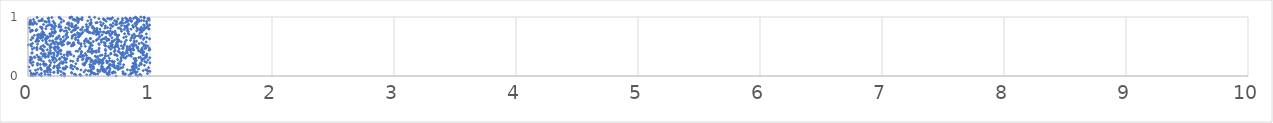
| Category | Series 0 |
|---|---|
| 0.7210757157536596 | 0.001 |
| 0.2989265851600752 | 0.002 |
| 0.9000821290145526 | 0.003 |
| 0.10947811891331494 | 0.004 |
| 0.04043967258399417 | 0.005 |
| 0.8376584052452829 | 0.006 |
| 0.026146847696138176 | 0.007 |
| 0.4328127904075124 | 0.008 |
| 0.8267326904231929 | 0.009 |
| 0.6585111228385325 | 0.01 |
| 0.9276628801899037 | 0.011 |
| 0.272278882932699 | 0.012 |
| 0.3926854934674824 | 0.013 |
| 0.18231622238900014 | 0.014 |
| 0.5095273871715241 | 0.015 |
| 0.8852031067765893 | 0.016 |
| 0.42643215903502185 | 0.017 |
| 0.059935583318995955 | 0.018 |
| 0.4809977433462945 | 0.019 |
| 0.16782910024507736 | 0.02 |
| 0.09316453717053252 | 0.021 |
| 0.7907250100718527 | 0.022 |
| 0.3857004847560078 | 0.023 |
| 0.4255585206848159 | 0.024 |
| 0.049419505402485187 | 0.025 |
| 0.6673545228250559 | 0.026 |
| 0.9171170175370059 | 0.027 |
| 0.38049555178321215 | 0.028 |
| 0.38638861033530436 | 0.029 |
| 0.14040069428345192 | 0.03 |
| 0.030642846496321097 | 0.031 |
| 0.5534999506559373 | 0.032 |
| 0.6495359501686248 | 0.033 |
| 0.3000917611044036 | 0.034 |
| 0.5427265277521784 | 0.035 |
| 0.8001576215564252 | 0.036 |
| 0.058565500979314566 | 0.037 |
| 0.04289846613452941 | 0.038 |
| 0.5723878880102399 | 0.039 |
| 0.7794816791335246 | 0.04 |
| 0.8411530563791975 | 0.041 |
| 0.9788533906604586 | 0.042 |
| 0.10970321104490843 | 0.043 |
| 0.5427314494202757 | 0.044 |
| 0.8498427818133956 | 0.045 |
| 0.29006370694518135 | 0.046 |
| 0.6506995016621157 | 0.047 |
| 0.02436283394171601 | 0.048 |
| 0.5200776425651998 | 0.049 |
| 0.6922005602271805 | 0.05 |
| 0.35854809630641893 | 0.051 |
| 0.7808786690038981 | 0.052 |
| 0.07402303675006461 | 0.053 |
| 0.24488214861204982 | 0.054 |
| 0.5305747288440449 | 0.055 |
| 0.8828841478558047 | 0.056 |
| 0.6954582827002016 | 0.057 |
| 0.3564258205151243 | 0.058 |
| 0.6913655197751492 | 0.059 |
| 0.7140232793334049 | 0.06 |
| 0.21004310257870018 | 0.061 |
| 0.8574704761486299 | 0.062 |
| 0.8679387637363696 | 0.063 |
| 0.18259161229031518 | 0.064 |
| 0.21422101752278055 | 0.065 |
| 0.6664067608362094 | 0.066 |
| 0.45959798751054415 | 0.067 |
| 0.15925088069788707 | 0.068 |
| 0.6348497576022162 | 0.069 |
| 0.8943841726293321 | 0.07 |
| 0.6281480698567632 | 0.071 |
| 0.7026516487185294 | 0.072 |
| 0.7779968495659232 | 0.073 |
| 0.5172572847217972 | 0.074 |
| 0.2704747958899747 | 0.075 |
| 0.13402724621408568 | 0.076 |
| 0.5881572272380724 | 0.077 |
| 0.9990344237598981 | 0.078 |
| 0.5133411046875807 | 0.079 |
| 0.6163663384614241 | 0.08 |
| 0.14228685457018153 | 0.081 |
| 0.5735538115490929 | 0.082 |
| 0.24654197819015478 | 0.083 |
| 0.9835086448790668 | 0.084 |
| 0.498593642804361 | 0.085 |
| 0.8749568164736927 | 0.086 |
| 0.49280286827748343 | 0.087 |
| 0.017346005906562878 | 0.088 |
| 0.6670152089388754 | 0.089 |
| 0.24894723392164386 | 0.09 |
| 0.9443205094887137 | 0.091 |
| 0.15813861067305646 | 0.092 |
| 0.24504026729531747 | 0.093 |
| 0.9775952237302944 | 0.094 |
| 0.6348667324303842 | 0.095 |
| 0.8391949864393048 | 0.096 |
| 0.06190213424419122 | 0.097 |
| 0.6154363124993141 | 0.098 |
| 0.47138724294197243 | 0.099 |
| 0.5136304304355692 | 0.1 |
| 0.43451845607670847 | 0.101 |
| 0.5718536091870989 | 0.102 |
| 0.5199059428949439 | 0.103 |
| 0.18459046426065895 | 0.104 |
| 0.17366434245243534 | 0.105 |
| 0.8147292378643486 | 0.106 |
| 0.9658043023019626 | 0.107 |
| 0.8706700151596727 | 0.108 |
| 0.10994075476835985 | 0.109 |
| 0.5970762837808996 | 0.11 |
| 0.854021269132305 | 0.111 |
| 0.7385922094919226 | 0.112 |
| 0.7418805030588554 | 0.113 |
| 0.29488644689727617 | 0.114 |
| 0.08140896163242661 | 0.115 |
| 0.6138732214986259 | 0.116 |
| 0.9062549506711998 | 0.117 |
| 0.3674051521951712 | 0.118 |
| 0.6225967629325416 | 0.119 |
| 0.16001259704083148 | 0.12 |
| 0.40652136543497164 | 0.121 |
| 0.3059076159507106 | 0.122 |
| 0.24648703166983255 | 0.123 |
| 0.17324443153000457 | 0.124 |
| 0.6725463648833583 | 0.125 |
| 0.61174687437837 | 0.126 |
| 0.399982566187824 | 0.127 |
| 0.6470994550307 | 0.128 |
| 0.5378220052708061 | 0.129 |
| 0.8711960430068021 | 0.13 |
| 0.5342572378955679 | 0.131 |
| 0.28638792737146057 | 0.132 |
| 0.7336366363484794 | 0.133 |
| 0.2924707362753357 | 0.134 |
| 0.758371457862031 | 0.135 |
| 0.7158906764775873 | 0.136 |
| 0.7628057716368419 | 0.137 |
| 0.10263753716967305 | 0.138 |
| 0.3506594092406672 | 0.139 |
| 0.21002128644068474 | 0.14 |
| 0.9875201829687993 | 0.141 |
| 0.1619580608958432 | 0.142 |
| 0.6540378630274599 | 0.143 |
| 0.8882529655415882 | 0.144 |
| 0.25865330087943905 | 0.145 |
| 0.2387487456786015 | 0.146 |
| 0.16351998095403542 | 0.147 |
| 0.777580641729575 | 0.148 |
| 0.5119197420914714 | 0.149 |
| 0.31843429713041993 | 0.15 |
| 0.7058444956360657 | 0.151 |
| 0.8574668615925476 | 0.152 |
| 0.008070416194821739 | 0.153 |
| 0.6086145802135168 | 0.154 |
| 0.6621210968759669 | 0.155 |
| 0.6619147044841546 | 0.156 |
| 0.8545281187465874 | 0.157 |
| 0.6080328342083019 | 0.158 |
| 0.3823285374581695 | 0.159 |
| 0.5366483728365018 | 0.16 |
| 0.6011960573795215 | 0.161 |
| 0.31124584441423775 | 0.162 |
| 0.8628599150664559 | 0.163 |
| 0.5191793822243911 | 0.164 |
| 0.7409790467848674 | 0.165 |
| 0.8869061776484861 | 0.166 |
| 0.17696402461778815 | 0.167 |
| 0.21685029689673507 | 0.168 |
| 0.5102896732666365 | 0.169 |
| 0.7300531628552824 | 0.17 |
| 0.36157757971813154 | 0.171 |
| 0.6919241419508552 | 0.172 |
| 0.8679782778862162 | 0.173 |
| 0.24216752925409957 | 0.174 |
| 0.35212633146471983 | 0.175 |
| 0.13678966365264045 | 0.176 |
| 0.9116738722368598 | 0.177 |
| 0.7044519702452783 | 0.178 |
| 0.3553126324411906 | 0.179 |
| 0.5189088892865402 | 0.18 |
| 0.9547105365185021 | 0.181 |
| 0.038127611285978524 | 0.182 |
| 0.6702026357527971 | 0.183 |
| 0.18163057918791703 | 0.184 |
| 0.07786117387902758 | 0.185 |
| 0.4606843811129724 | 0.186 |
| 0.2546271264985037 | 0.187 |
| 0.6689690770090997 | 0.188 |
| 0.7842074549459827 | 0.189 |
| 0.14968710963572007 | 0.19 |
| 0.46270043377741055 | 0.191 |
| 0.13665122851060474 | 0.192 |
| 0.5065750376332786 | 0.193 |
| 0.675863379049547 | 0.194 |
| 0.8853062580979848 | 0.195 |
| 0.10051173781103595 | 0.196 |
| 0.702789771151127 | 0.197 |
| 0.12841367516878333 | 0.198 |
| 0.9292910685136894 | 0.199 |
| 0.12959795341944402 | 0.2 |
| 0.7562174939081766 | 0.201 |
| 0.45005737925494704 | 0.202 |
| 0.1407330098968702 | 0.203 |
| 0.12831138843680767 | 0.204 |
| 0.8745258126317434 | 0.205 |
| 0.5811936389561184 | 0.206 |
| 0.6056014076742957 | 0.207 |
| 0.9242970961061321 | 0.208 |
| 0.3927566318276803 | 0.209 |
| 0.534009398452319 | 0.21 |
| 0.5489094535295872 | 0.211 |
| 0.28188360323676254 | 0.212 |
| 0.2599949119441829 | 0.213 |
| 0.07832147189925154 | 0.214 |
| 0.025188086981462243 | 0.215 |
| 0.7422451927611835 | 0.216 |
| 0.860800881905322 | 0.217 |
| 0.46370342496185346 | 0.218 |
| 0.9225494298928072 | 0.219 |
| 0.5425298097760574 | 0.22 |
| 0.6163873099898138 | 0.221 |
| 0.2889374134576238 | 0.222 |
| 0.6495001251611316 | 0.223 |
| 0.9990132359650231 | 0.224 |
| 0.650295007836843 | 0.225 |
| 0.47280584722660846 | 0.226 |
| 0.6990052348544215 | 0.227 |
| 0.18702264352550013 | 0.228 |
| 0.9723218593729294 | 0.229 |
| 0.29079006444968714 | 0.23 |
| 0.3125662497456033 | 0.231 |
| 0.2177005317458538 | 0.232 |
| 0.5914535935894576 | 0.233 |
| 0.8792446512119577 | 0.234 |
| 0.04248100462328064 | 0.235 |
| 0.5756050601108011 | 0.236 |
| 0.6506869706622691 | 0.237 |
| 0.5617526958728309 | 0.238 |
| 0.6082924878706019 | 0.239 |
| 0.2754196331329576 | 0.24 |
| 0.5154132024791686 | 0.241 |
| 0.017545923957011267 | 0.242 |
| 0.12759780830335365 | 0.243 |
| 0.7073635761500626 | 0.244 |
| 0.9584881517609275 | 0.245 |
| 0.7582191738133515 | 0.246 |
| 0.6895943118848235 | 0.247 |
| 0.3680063421629647 | 0.248 |
| 0.5431479827110831 | 0.249 |
| 0.5206833043588635 | 0.25 |
| 0.5784357333386534 | 0.251 |
| 0.4817474268431772 | 0.252 |
| 0.6893397859311813 | 0.253 |
| 0.878172736813518 | 0.254 |
| 0.6432311320550751 | 0.255 |
| 0.34959527669613344 | 0.256 |
| 0.6676213800285858 | 0.257 |
| 0.9342676573753379 | 0.258 |
| 0.5173602275671156 | 0.259 |
| 0.17603989437212064 | 0.26 |
| 0.4067987170120677 | 0.261 |
| 0.8838337499884558 | 0.262 |
| 0.8871132139931058 | 0.263 |
| 0.23504058183472665 | 0.264 |
| 0.1087322810933461 | 0.265 |
| 0.7635461462532201 | 0.266 |
| 0.20537391214698564 | 0.267 |
| 0.594452615871023 | 0.268 |
| 0.30170983834987253 | 0.269 |
| 0.5557868469854249 | 0.27 |
| 0.4783299405408188 | 0.271 |
| 0.9831407160521641 | 0.272 |
| 0.5234314439553772 | 0.273 |
| 0.6108272540907288 | 0.274 |
| 0.01644683085317622 | 0.275 |
| 0.4461334835144811 | 0.276 |
| 0.08847333643659516 | 0.277 |
| 0.7349414650630675 | 0.278 |
| 0.6156961316484116 | 0.279 |
| 0.0290944397070243 | 0.28 |
| 0.20184487301246923 | 0.281 |
| 0.259252226098324 | 0.282 |
| 0.31360663814240053 | 0.283 |
| 0.2046473946518782 | 0.284 |
| 0.9331819331798564 | 0.285 |
| 0.8777192377690918 | 0.286 |
| 0.9403291724191035 | 0.287 |
| 0.49255471691415087 | 0.288 |
| 0.5783075625545605 | 0.289 |
| 0.3185698828960907 | 0.29 |
| 0.4077013007586274 | 0.291 |
| 0.1060889975442274 | 0.292 |
| 0.948653179887867 | 0.293 |
| 0.4522807809927608 | 0.294 |
| 0.8681703638850157 | 0.295 |
| 0.301736736388613 | 0.296 |
| 0.2597961905755358 | 0.297 |
| 0.8816857522671876 | 0.298 |
| 0.22350650507824765 | 0.299 |
| 0.5083475468655909 | 0.3 |
| 0.6666974718932039 | 0.301 |
| 0.7978874445272033 | 0.302 |
| 0.6262560378153953 | 0.303 |
| 0.4821397148627352 | 0.304 |
| 0.02945537063661785 | 0.305 |
| 0.49373557308125704 | 0.306 |
| 0.7643427294269092 | 0.307 |
| 0.29728209812901507 | 0.308 |
| 0.9619062339465713 | 0.309 |
| 0.9980874058942363 | 0.31 |
| 0.05637753653543942 | 0.311 |
| 0.9078455281775442 | 0.312 |
| 0.7644026433603119 | 0.313 |
| 0.7862463732100281 | 0.314 |
| 0.21182670599094267 | 0.315 |
| 0.921608592586544 | 0.316 |
| 0.1418444484118636 | 0.317 |
| 0.08269069203202983 | 0.318 |
| 0.09428149524336693 | 0.319 |
| 0.5631708534605753 | 0.32 |
| 0.020087590254180276 | 0.321 |
| 0.2774874136585832 | 0.322 |
| 0.050359147794461045 | 0.323 |
| 0.9702013628032757 | 0.324 |
| 0.1975659146478237 | 0.325 |
| 0.16690738356669665 | 0.326 |
| 0.4273368200520453 | 0.327 |
| 0.14624323308448772 | 0.328 |
| 0.43905520418846955 | 0.329 |
| 0.57270099116623 | 0.33 |
| 0.4174305538330355 | 0.331 |
| 0.8088734970209466 | 0.332 |
| 0.8457224602285318 | 0.333 |
| 0.6350830926671499 | 0.334 |
| 0.5504235750380612 | 0.335 |
| 0.12114598333544369 | 0.336 |
| 0.37610349666111076 | 0.337 |
| 0.9726020182688154 | 0.338 |
| 0.45789537538776204 | 0.339 |
| 0.23901064458285648 | 0.34 |
| 0.32417671824738037 | 0.341 |
| 0.9623730830173374 | 0.342 |
| 0.7316335424702959 | 0.343 |
| 0.6570736529194579 | 0.344 |
| 0.6339614023577463 | 0.345 |
| 0.47934776001750434 | 0.346 |
| 0.450088438837034 | 0.347 |
| 0.5925824909882226 | 0.348 |
| 0.7812049166427784 | 0.349 |
| 0.827664353694022 | 0.35 |
| 0.16630293439816402 | 0.351 |
| 0.7732514586429635 | 0.352 |
| 0.07377069541614367 | 0.353 |
| 0.6075511643695319 | 0.354 |
| 0.2954089938622019 | 0.355 |
| 0.9418425406323444 | 0.356 |
| 0.21398010608531137 | 0.357 |
| 0.7232720056567803 | 0.358 |
| 0.7139591477125702 | 0.359 |
| 0.7108441540734324 | 0.36 |
| 0.1264873315648778 | 0.361 |
| 0.13647488744453973 | 0.362 |
| 0.8444022728128121 | 0.363 |
| 0.35353027062375997 | 0.364 |
| 0.2450625903071295 | 0.365 |
| 0.13811698869958555 | 0.366 |
| 0.9450672852378702 | 0.367 |
| 0.7638396645166099 | 0.368 |
| 0.3179253763783799 | 0.369 |
| 0.34159261332528057 | 0.37 |
| 0.4331996249434473 | 0.371 |
| 0.9748741301679823 | 0.372 |
| 0.6778101371705476 | 0.373 |
| 0.18308310946795958 | 0.374 |
| 0.14171553402207726 | 0.375 |
| 0.13370401589096814 | 0.376 |
| 0.26885084400335857 | 0.377 |
| 0.8592734256729139 | 0.378 |
| 0.7954542486420636 | 0.379 |
| 0.46992454120686145 | 0.38 |
| 0.6355293393602538 | 0.381 |
| 0.7600331612921489 | 0.382 |
| 0.10878309441259448 | 0.383 |
| 0.6798303783693587 | 0.384 |
| 0.5249780834113048 | 0.385 |
| 0.03206839631767655 | 0.386 |
| 0.17877729065115944 | 0.387 |
| 0.1948435103795031 | 0.388 |
| 0.24450818007682085 | 0.389 |
| 0.21339154059951548 | 0.39 |
| 0.81433718378727 | 0.391 |
| 0.33814986949393677 | 0.392 |
| 0.340241658540967 | 0.393 |
| 0.17063767525423645 | 0.394 |
| 0.7758485495579943 | 0.395 |
| 0.03363944550812892 | 0.396 |
| 0.9417981043945421 | 0.397 |
| 0.9255202552975204 | 0.398 |
| 0.7793864667869613 | 0.399 |
| 0.3240337484924495 | 0.4 |
| 0.5588029934734943 | 0.401 |
| 0.7506627527765466 | 0.402 |
| 0.4384610805472434 | 0.403 |
| 0.24095528802749144 | 0.404 |
| 0.8440585181917223 | 0.405 |
| 0.9469581283379359 | 0.406 |
| 0.9482286038480302 | 0.407 |
| 0.3445583771227654 | 0.408 |
| 0.32828142125068804 | 0.409 |
| 0.8077475183541016 | 0.41 |
| 0.5803354550789511 | 0.411 |
| 0.5073919869033248 | 0.412 |
| 0.7078714407118015 | 0.413 |
| 0.5421371083143695 | 0.414 |
| 0.4383714600283911 | 0.415 |
| 0.5199634460527002 | 0.416 |
| 0.25565169546685795 | 0.417 |
| 0.7390118082130677 | 0.418 |
| 0.4906166428473757 | 0.419 |
| 0.4093506284338122 | 0.42 |
| 0.39370009381890514 | 0.421 |
| 0.5335773624270365 | 0.422 |
| 0.9203672280666437 | 0.423 |
| 0.4937298917718783 | 0.424 |
| 0.12633569073658568 | 0.425 |
| 0.5579896407327306 | 0.426 |
| 0.906791766730479 | 0.427 |
| 0.12280045910080761 | 0.428 |
| 0.9318291597716524 | 0.429 |
| 0.6362633731395777 | 0.43 |
| 0.9254075710624784 | 0.431 |
| 0.2711285001179622 | 0.432 |
| 0.18270840018388357 | 0.433 |
| 0.22552982454494974 | 0.434 |
| 0.929687994636196 | 0.435 |
| 0.7128788189450189 | 0.436 |
| 0.26578994557077174 | 0.437 |
| 0.9918890682903168 | 0.438 |
| 0.5786590418405029 | 0.439 |
| 0.82834390289123 | 0.44 |
| 0.8091550449191578 | 0.441 |
| 0.8670110847807508 | 0.442 |
| 0.07395535791818086 | 0.443 |
| 0.15801697483177912 | 0.444 |
| 0.8420784356487386 | 0.445 |
| 0.12041346718280588 | 0.446 |
| 0.9300892459747976 | 0.447 |
| 0.9982403552579645 | 0.448 |
| 0.9359544300214305 | 0.449 |
| 0.6344741235169882 | 0.45 |
| 0.8598731321625254 | 0.451 |
| 0.11428187942486412 | 0.452 |
| 0.861722414196641 | 0.453 |
| 0.6782922467358006 | 0.454 |
| 0.42447511901385315 | 0.455 |
| 0.0358636738968553 | 0.456 |
| 0.5229913672471264 | 0.457 |
| 0.747729481537171 | 0.458 |
| 0.5032213540697893 | 0.459 |
| 0.2483572041784291 | 0.46 |
| 0.8407170462101533 | 0.461 |
| 0.959066329176043 | 0.462 |
| 0.21497748240375014 | 0.463 |
| 0.9003665048937085 | 0.464 |
| 0.7750172626942908 | 0.465 |
| 0.10114258460016867 | 0.466 |
| 0.4240310337850348 | 0.467 |
| 0.07285559417100274 | 0.468 |
| 0.8382389106059709 | 0.469 |
| 0.9941360447711691 | 0.47 |
| 0.934859448884598 | 0.471 |
| 0.58338482854518 | 0.472 |
| 0.7814982172367695 | 0.473 |
| 0.815241480416861 | 0.474 |
| 0.24713598140410242 | 0.475 |
| 0.05063907220975772 | 0.476 |
| 0.18088641507700332 | 0.477 |
| 0.506234801875241 | 0.478 |
| 0.9671193752261402 | 0.479 |
| 0.21319851571478976 | 0.48 |
| 0.24932100242044186 | 0.481 |
| 0.6661786536033643 | 0.482 |
| 0.706571183758089 | 0.483 |
| 0.8942031509591887 | 0.484 |
| 0.22854649448995057 | 0.485 |
| 0.0727936329596034 | 0.486 |
| 0.6916633993997188 | 0.487 |
| 0.7157828793925304 | 0.488 |
| 0.1908328196929533 | 0.489 |
| 0.8994852326551687 | 0.49 |
| 0.2377770720487864 | 0.491 |
| 0.7372843405846279 | 0.492 |
| 0.1354199584911404 | 0.493 |
| 0.22328034682893239 | 0.494 |
| 0.5089463947137606 | 0.495 |
| 0.7800643921402242 | 0.496 |
| 0.8615064384627059 | 0.497 |
| 0.10740016915941564 | 0.498 |
| 0.8124022792604232 | 0.499 |
| 0.6607115354853395 | 0.5 |
| 0.8327363183237747 | 0.501 |
| 0.7184175100464548 | 0.502 |
| 0.46957089578978695 | 0.503 |
| 0.9486921610654752 | 0.504 |
| 0.02923747377671071 | 0.505 |
| 0.43647559859982266 | 0.506 |
| 0.6384385151941049 | 0.507 |
| 0.9818272447522768 | 0.508 |
| 0.3563899542382528 | 0.509 |
| 0.68626298339115 | 0.51 |
| 0.7210647271956351 | 0.511 |
| 0.7648150323040701 | 0.512 |
| 0.8707602179414884 | 0.513 |
| 0.6822601461201384 | 0.514 |
| 0.17800352319887125 | 0.515 |
| 0.36940887758846586 | 0.516 |
| 0.12498815872790503 | 0.517 |
| 0.9657037343737516 | 0.518 |
| 0.279009819369044 | 0.519 |
| 0.5272382905273694 | 0.52 |
| 0.6277265425681205 | 0.521 |
| 0.5136820650031169 | 0.522 |
| 0.8850004292603036 | 0.523 |
| 0.7344738402353681 | 0.524 |
| 0.002487908752155321 | 0.525 |
| 0.7214168779651005 | 0.526 |
| 0.3629615730674143 | 0.527 |
| 0.8571291769316965 | 0.528 |
| 0.7904624743258105 | 0.529 |
| 0.8498812239398275 | 0.53 |
| 0.6912237128096209 | 0.531 |
| 0.2915970047161808 | 0.532 |
| 0.24453267745566998 | 0.533 |
| 0.5835994769929335 | 0.534 |
| 0.022003704147762204 | 0.535 |
| 0.37838833860620535 | 0.536 |
| 0.36679830973281047 | 0.537 |
| 0.15963537086226853 | 0.538 |
| 0.078066801902817 | 0.539 |
| 0.947812759962714 | 0.54 |
| 0.7918922849996054 | 0.541 |
| 0.21825228250103756 | 0.542 |
| 0.43088996951977265 | 0.543 |
| 0.19149567483942576 | 0.544 |
| 0.3251595237430631 | 0.545 |
| 0.4347308424805034 | 0.546 |
| 0.5808678730343376 | 0.547 |
| 0.2640105543088852 | 0.548 |
| 0.9100226464094845 | 0.549 |
| 0.4626633018697137 | 0.55 |
| 0.32992752307183937 | 0.551 |
| 0.6756514822795858 | 0.552 |
| 0.03702181508974367 | 0.553 |
| 0.2476553751441185 | 0.554 |
| 0.6331137915363628 | 0.555 |
| 0.5156199487177917 | 0.556 |
| 0.3432074299609996 | 0.557 |
| 0.7289503063721577 | 0.558 |
| 0.8707879472128417 | 0.559 |
| 0.7269818894420691 | 0.56 |
| 0.14665660921299783 | 0.561 |
| 0.9325782274695004 | 0.562 |
| 0.41329652723456856 | 0.563 |
| 0.2768983365989266 | 0.564 |
| 0.499932471058238 | 0.565 |
| 0.3733894326710657 | 0.566 |
| 0.32898451866001854 | 0.567 |
| 0.20942122232944949 | 0.568 |
| 0.6232248929618235 | 0.569 |
| 0.7304176631304328 | 0.57 |
| 0.26673885782608686 | 0.571 |
| 0.4130512771910775 | 0.572 |
| 0.5005693086121781 | 0.573 |
| 0.6885716632852459 | 0.574 |
| 0.6012494007117316 | 0.575 |
| 0.2322444377652444 | 0.576 |
| 0.9681969559601877 | 0.577 |
| 0.764374323090072 | 0.578 |
| 0.484285251146534 | 0.579 |
| 0.7960294045028213 | 0.58 |
| 0.7398678473668885 | 0.581 |
| 0.14964921950913446 | 0.582 |
| 0.2864478094514332 | 0.583 |
| 0.6967961249649935 | 0.584 |
| 0.5346433333089294 | 0.585 |
| 0.06457393519117938 | 0.586 |
| 0.2056336419972309 | 0.587 |
| 0.08642626501174688 | 0.588 |
| 0.8896049869686045 | 0.589 |
| 0.869487764688466 | 0.59 |
| 0.46208584844211253 | 0.591 |
| 0.07397921444430067 | 0.592 |
| 0.29685269118183333 | 0.593 |
| 0.6902293486712231 | 0.594 |
| 0.7488392946691472 | 0.595 |
| 0.492404729551557 | 0.596 |
| 0.20115238067612562 | 0.597 |
| 0.1775286292261926 | 0.598 |
| 0.6465196994623977 | 0.599 |
| 0.2945500652398819 | 0.6 |
| 0.08371398514248485 | 0.601 |
| 0.11964058886515316 | 0.602 |
| 0.07012993914937815 | 0.603 |
| 0.5603187135644235 | 0.604 |
| 0.8405718376829686 | 0.605 |
| 0.410575647397453 | 0.606 |
| 0.8061326239219938 | 0.607 |
| 0.4700893156553666 | 0.608 |
| 0.7100881865490033 | 0.609 |
| 0.6623499573154773 | 0.61 |
| 0.14523450130200188 | 0.611 |
| 0.5985928012599377 | 0.612 |
| 0.024442301336616956 | 0.613 |
| 0.7421076185359031 | 0.614 |
| 0.7340969776784985 | 0.615 |
| 0.5670182354292502 | 0.616 |
| 0.2678257910847175 | 0.617 |
| 0.3901185637865693 | 0.618 |
| 0.14549145149834963 | 0.619 |
| 0.9448634629450845 | 0.62 |
| 0.6531062021625528 | 0.621 |
| 0.6111964511949463 | 0.622 |
| 0.6626431990512346 | 0.623 |
| 0.0748861568657917 | 0.624 |
| 0.22753821549376063 | 0.625 |
| 0.267665783676332 | 0.626 |
| 0.1428943305385456 | 0.627 |
| 0.47784755663572787 | 0.628 |
| 0.3105044382118243 | 0.629 |
| 0.9962865770648415 | 0.63 |
| 0.7271649662699567 | 0.631 |
| 0.6229809147064088 | 0.632 |
| 0.5133869856991241 | 0.633 |
| 0.5760949789387831 | 0.634 |
| 0.6306975262485998 | 0.635 |
| 0.5100751903818915 | 0.636 |
| 0.24178280388083218 | 0.637 |
| 0.8691774487984826 | 0.638 |
| 0.15797994142735672 | 0.639 |
| 0.36003542441528147 | 0.64 |
| 0.100528346971405 | 0.641 |
| 0.039505102122388 | 0.642 |
| 0.8471321678157664 | 0.643 |
| 0.10357562126065123 | 0.644 |
| 0.9524491028877411 | 0.645 |
| 0.39002167320598147 | 0.646 |
| 0.23559801597382835 | 0.647 |
| 0.9227022665742365 | 0.648 |
| 0.6880141072916863 | 0.649 |
| 0.16107267055085683 | 0.65 |
| 0.07996499769882048 | 0.651 |
| 0.7845736762240205 | 0.652 |
| 0.9738699851219756 | 0.653 |
| 0.12090360836236602 | 0.654 |
| 0.03542665855553606 | 0.655 |
| 0.1516963020441522 | 0.656 |
| 0.3246809422331872 | 0.657 |
| 0.6389032313386714 | 0.658 |
| 0.4146082069613264 | 0.659 |
| 0.10569683996996093 | 0.66 |
| 0.16345341066740893 | 0.661 |
| 0.28961643931696246 | 0.662 |
| 0.4100819663577271 | 0.663 |
| 0.7352355954440289 | 0.664 |
| 0.3222726860070083 | 0.665 |
| 0.25291790520305846 | 0.666 |
| 0.8052703026317003 | 0.667 |
| 0.8784409154741092 | 0.668 |
| 0.5877859500658703 | 0.669 |
| 0.15841373701675066 | 0.67 |
| 0.36507813575640125 | 0.671 |
| 0.18194813471528237 | 0.672 |
| 0.08474547202751637 | 0.673 |
| 0.8545795329060992 | 0.674 |
| 0.11345772384344044 | 0.675 |
| 0.9333907563221521 | 0.676 |
| 0.2028945621189534 | 0.677 |
| 0.8822599759625623 | 0.678 |
| 0.9050033223741482 | 0.679 |
| 0.9301596291496056 | 0.68 |
| 0.2543797314080384 | 0.681 |
| 0.42631340380039906 | 0.682 |
| 0.3643271305004465 | 0.683 |
| 0.9102937605874176 | 0.684 |
| 0.1072775346935565 | 0.685 |
| 0.6735666500634637 | 0.686 |
| 0.7326824227249412 | 0.687 |
| 0.8543484322336589 | 0.688 |
| 0.05234688737668036 | 0.689 |
| 0.12721577101469905 | 0.69 |
| 0.3098834288499023 | 0.691 |
| 0.3913916556576854 | 0.692 |
| 0.7442695944049967 | 0.693 |
| 0.07693263391948424 | 0.694 |
| 0.7248534526896754 | 0.695 |
| 0.08387147627899416 | 0.696 |
| 0.18520783663246365 | 0.697 |
| 0.1378961229461677 | 0.698 |
| 0.6067967512428174 | 0.699 |
| 0.11859103536862903 | 0.7 |
| 0.5605800857830322 | 0.701 |
| 0.4163155080233807 | 0.702 |
| 0.38136739476426584 | 0.703 |
| 0.088628327083352 | 0.704 |
| 0.7131751646601504 | 0.705 |
| 0.3144325179341042 | 0.706 |
| 0.4155414833343066 | 0.707 |
| 0.8272705206838905 | 0.708 |
| 0.577885741775514 | 0.709 |
| 0.4325251408466785 | 0.71 |
| 0.8690539856131481 | 0.711 |
| 0.685502705998013 | 0.712 |
| 0.969991510012652 | 0.713 |
| 0.17817750141450017 | 0.714 |
| 0.7168408061707249 | 0.715 |
| 0.4219397593059211 | 0.716 |
| 0.7914409090286184 | 0.717 |
| 0.18864575147695095 | 0.718 |
| 0.1076039127480839 | 0.719 |
| 0.4403261241039643 | 0.72 |
| 0.5725598643984897 | 0.721 |
| 0.6649391277680795 | 0.722 |
| 0.5395822278480225 | 0.723 |
| 0.21262131485348734 | 0.724 |
| 0.5664393405706758 | 0.725 |
| 0.8212366428941156 | 0.726 |
| 0.5291628351705181 | 0.727 |
| 0.9183074211362936 | 0.728 |
| 0.6426032618617348 | 0.729 |
| 0.7146461717272955 | 0.73 |
| 0.12891808994259268 | 0.731 |
| 0.6467089960409784 | 0.732 |
| 0.40615453817303226 | 0.733 |
| 0.6407962776640681 | 0.734 |
| 0.3209628533042751 | 0.735 |
| 0.5775096556218271 | 0.736 |
| 0.5104390362815615 | 0.737 |
| 0.4985330865294788 | 0.738 |
| 0.22412331899377902 | 0.739 |
| 0.6925814376064413 | 0.74 |
| 0.623727574144228 | 0.741 |
| 0.4492782341478002 | 0.742 |
| 0.20803729534435755 | 0.743 |
| 0.6939597602960598 | 0.744 |
| 0.19873769237115813 | 0.745 |
| 0.35664738909281224 | 0.746 |
| 0.61742121878766 | 0.747 |
| 0.9336934556386809 | 0.748 |
| 0.5941072268537098 | 0.749 |
| 0.020558138225648226 | 0.75 |
| 0.5536079906784557 | 0.751 |
| 0.2209282563103161 | 0.752 |
| 0.6561742065690109 | 0.753 |
| 0.8224506468756344 | 0.754 |
| 0.11835598016545368 | 0.755 |
| 0.4910936729073455 | 0.756 |
| 0.4829222523250082 | 0.757 |
| 0.7661005896458787 | 0.758 |
| 0.222744368522532 | 0.759 |
| 0.7137954069159483 | 0.76 |
| 0.295791097195778 | 0.761 |
| 0.26470102245164884 | 0.762 |
| 0.5677114096309106 | 0.763 |
| 0.674362562790208 | 0.764 |
| 0.890847477299483 | 0.765 |
| 0.31397995208020135 | 0.766 |
| 0.06657312197355802 | 0.767 |
| 0.5413483766147531 | 0.768 |
| 0.9265029964697052 | 0.769 |
| 0.035861712793633926 | 0.77 |
| 0.8128876725642603 | 0.771 |
| 0.37000765159936 | 0.772 |
| 0.02378333411548783 | 0.773 |
| 0.036038161383266876 | 0.774 |
| 0.06808552967765713 | 0.775 |
| 0.46525423901427343 | 0.776 |
| 0.5645849939014208 | 0.777 |
| 0.9471329900442009 | 0.778 |
| 0.9163332662726326 | 0.779 |
| 0.3825306995435144 | 0.78 |
| 0.26726707632011837 | 0.781 |
| 0.4864678289119405 | 0.782 |
| 0.4306035897047693 | 0.783 |
| 0.2765094350904077 | 0.784 |
| 0.07235198391573117 | 0.785 |
| 0.3887096254384832 | 0.786 |
| 0.4394667676189996 | 0.787 |
| 0.7644944832490032 | 0.788 |
| 0.7886953339744882 | 0.789 |
| 0.33930857999470376 | 0.79 |
| 0.9386122548721813 | 0.791 |
| 0.19289676054082594 | 0.792 |
| 0.8447505407541762 | 0.793 |
| 0.5900271018681903 | 0.794 |
| 0.4836743484312529 | 0.795 |
| 0.9006744038144685 | 0.796 |
| 0.9920480181709131 | 0.797 |
| 0.21616338055789674 | 0.798 |
| 0.5614019566368801 | 0.799 |
| 0.1458492905121831 | 0.8 |
| 0.11456744370238403 | 0.801 |
| 0.8178496894156934 | 0.802 |
| 0.9879125559095848 | 0.803 |
| 0.9611521296220341 | 0.804 |
| 0.5656311839789395 | 0.805 |
| 0.922476162558392 | 0.806 |
| 0.5430228410689175 | 0.807 |
| 0.6765065295022359 | 0.808 |
| 0.39750369731249346 | 0.809 |
| 0.6306398672416818 | 0.81 |
| 0.7389050727569457 | 0.811 |
| 0.8932130046438367 | 0.812 |
| 0.009867603998196639 | 0.813 |
| 0.7519545724265175 | 0.814 |
| 0.5287462806908088 | 0.815 |
| 0.32985117880293147 | 0.816 |
| 0.40967499015266284 | 0.817 |
| 0.30833292964294845 | 0.818 |
| 0.9534547181962726 | 0.819 |
| 0.6514500875347935 | 0.82 |
| 0.8012121601739407 | 0.821 |
| 0.3793559192255197 | 0.822 |
| 0.11429399096382642 | 0.823 |
| 0.21608679825144395 | 0.824 |
| 0.9295325106563802 | 0.825 |
| 0.4482053671534406 | 0.826 |
| 0.4936508198361368 | 0.827 |
| 0.9714187851935963 | 0.828 |
| 0.8636554404103304 | 0.829 |
| 0.10232828768921798 | 0.83 |
| 0.26412987950540867 | 0.831 |
| 0.8626162504612896 | 0.832 |
| 0.25152540822775327 | 0.833 |
| 0.8076975914196856 | 0.834 |
| 0.3623723252874913 | 0.835 |
| 0.2690320265909233 | 0.836 |
| 0.8072480423371723 | 0.837 |
| 0.4803891852450414 | 0.838 |
| 0.1986005415658082 | 0.839 |
| 0.5295578614298336 | 0.84 |
| 0.3568377220874487 | 0.841 |
| 0.6942573590099614 | 0.842 |
| 0.1522944205746798 | 0.843 |
| 0.9820651435421491 | 0.844 |
| 0.8078846024346175 | 0.845 |
| 0.3871715278033683 | 0.846 |
| 0.791839495547264 | 0.847 |
| 0.6339178060635999 | 0.848 |
| 0.22581076149102586 | 0.849 |
| 0.8843494483472958 | 0.85 |
| 0.36005668460265083 | 0.851 |
| 0.604871638184013 | 0.852 |
| 0.19934483925496183 | 0.853 |
| 0.7660875270716876 | 0.854 |
| 0.8150172255272511 | 0.855 |
| 0.8587111250587323 | 0.856 |
| 0.9537230121415242 | 0.857 |
| 0.6829051163125681 | 0.858 |
| 0.1907529786579547 | 0.859 |
| 0.3373643923677242 | 0.86 |
| 0.3943625362805995 | 0.861 |
| 0.508519657774172 | 0.862 |
| 0.16776013495167486 | 0.863 |
| 0.9955251294660129 | 0.864 |
| 0.6751951815767941 | 0.865 |
| 0.9484600633766458 | 0.866 |
| 0.3603773410655067 | 0.867 |
| 0.1850803583332098 | 0.868 |
| 0.5983121830610115 | 0.869 |
| 0.2553484766665016 | 0.87 |
| 0.7168366251511891 | 0.871 |
| 0.4783914676211398 | 0.872 |
| 0.1273497581138584 | 0.873 |
| 0.7281072456674824 | 0.874 |
| 0.010252795348284716 | 0.875 |
| 0.8250291088687431 | 0.876 |
| 0.04374079946631271 | 0.877 |
| 0.020821309670766563 | 0.878 |
| 0.036035984824255185 | 0.879 |
| 0.5159968793793652 | 0.88 |
| 0.03174811906556241 | 0.881 |
| 0.32163811846832513 | 0.882 |
| 0.0705584851420541 | 0.883 |
| 0.974791999786743 | 0.884 |
| 0.8920264859425202 | 0.885 |
| 0.22020029296440624 | 0.886 |
| 0.3581185425959956 | 0.887 |
| 0.5066654637466728 | 0.888 |
| 0.6171297078071348 | 0.889 |
| 0.8770764614182067 | 0.89 |
| 0.5155391620783404 | 0.891 |
| 0.7524928570316174 | 0.892 |
| 0.7782579835984104 | 0.893 |
| 0.010391665333246647 | 0.894 |
| 0.8886134198926825 | 0.895 |
| 0.6976812970808445 | 0.896 |
| 0.215070051770354 | 0.897 |
| 0.7679778140810448 | 0.898 |
| 0.32772947196606095 | 0.899 |
| 0.3349980383016643 | 0.9 |
| 0.5568727777435901 | 0.901 |
| 0.05454026355690256 | 0.902 |
| 0.013561366036844658 | 0.903 |
| 0.8953785168820874 | 0.904 |
| 0.4096193192959231 | 0.905 |
| 0.5672389327003117 | 0.906 |
| 0.7994619198030694 | 0.907 |
| 0.5170183412948649 | 0.908 |
| 0.27095700155080304 | 0.909 |
| 0.1729514217271586 | 0.91 |
| 0.026586387638230624 | 0.911 |
| 0.7623798802590689 | 0.912 |
| 0.5945514866155894 | 0.913 |
| 0.15181415824028188 | 0.914 |
| 0.7245823360911892 | 0.915 |
| 0.8952028191062921 | 0.916 |
| 0.814793839037762 | 0.917 |
| 0.05295277205867999 | 0.918 |
| 0.890818753772518 | 0.919 |
| 0.9718569829747519 | 0.92 |
| 0.40991761649660396 | 0.921 |
| 0.015467040262562848 | 0.922 |
| 0.9738851673574654 | 0.923 |
| 0.13900687204180162 | 0.924 |
| 0.8469195385628864 | 0.925 |
| 0.2068624277203358 | 0.926 |
| 0.9118087606103399 | 0.927 |
| 0.6408421085857157 | 0.928 |
| 0.7258657194825938 | 0.929 |
| 0.9015500933295364 | 0.93 |
| 0.8500918643745288 | 0.931 |
| 0.2920840632183207 | 0.932 |
| 0.08863884093429486 | 0.933 |
| 0.4899072108005943 | 0.934 |
| 0.09889885951297839 | 0.935 |
| 0.8439845011073305 | 0.936 |
| 0.9502748022539501 | 0.937 |
| 0.1722902743973057 | 0.938 |
| 0.7107411215468454 | 0.939 |
| 0.9304335573894746 | 0.94 |
| 0.8258641810279166 | 0.941 |
| 0.11737574120262495 | 0.942 |
| 0.39459191051968256 | 0.943 |
| 0.7747758308586202 | 0.944 |
| 0.11021009096494161 | 0.945 |
| 0.8117058087972228 | 0.946 |
| 0.020245450538639242 | 0.947 |
| 0.9935162270032507 | 0.948 |
| 0.3837046640335655 | 0.949 |
| 0.629272069465779 | 0.95 |
| 0.37907474110380845 | 0.951 |
| 0.5157228387148857 | 0.952 |
| 0.897910948218152 | 0.953 |
| 0.38004007153537034 | 0.954 |
| 0.4436664577298499 | 0.955 |
| 0.6218652319026474 | 0.956 |
| 0.9084796819128683 | 0.957 |
| 0.0452926098082308 | 0.958 |
| 0.4216102676994564 | 0.959 |
| 0.36917846486068473 | 0.96 |
| 0.27276174618081483 | 0.961 |
| 0.414027804738765 | 0.962 |
| 0.6810452283700805 | 0.963 |
| 0.6690984861139234 | 0.964 |
| 0.4374638933650511 | 0.965 |
| 0.11687761200657432 | 0.966 |
| 0.8096128045911569 | 0.967 |
| 0.7379102013959262 | 0.968 |
| 0.9821798552254009 | 0.969 |
| 0.6187428459012664 | 0.97 |
| 0.5814676599273232 | 0.971 |
| 0.672206360240103 | 0.972 |
| 0.7739901160836807 | 0.973 |
| 0.16545327473373683 | 0.974 |
| 0.8650805109376994 | 0.975 |
| 0.8381746122343142 | 0.976 |
| 0.6524943251820617 | 0.977 |
| 0.8381267312730432 | 0.978 |
| 0.9901887551952372 | 0.979 |
| 0.8911900981068307 | 0.98 |
| 0.3442425226799871 | 0.981 |
| 0.1691990560394483 | 0.982 |
| 0.7994220009718803 | 0.983 |
| 0.8894733708927031 | 0.984 |
| 0.2593771991567875 | 0.985 |
| 0.9537358741931827 | 0.986 |
| 0.40303403486787504 | 0.987 |
| 0.6929375403053648 | 0.988 |
| 0.44320071157956886 | 0.989 |
| 0.9509631102121828 | 0.99 |
| 0.19538270618005804 | 0.991 |
| 0.0751698163177219 | 0.992 |
| 0.34471365015116706 | 0.993 |
| 0.5465669176311503 | 0.994 |
| 0.2562105193295303 | 0.995 |
| 0.8800534397998682 | 0.996 |
| 0.9521997637617636 | 0.997 |
| 0.5028891011026042 | 0.998 |
| 0.3585414342214319 | 0.999 |
| 0.9249476978968554 | 1 |